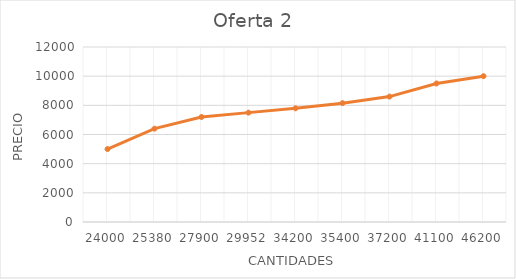
| Category | Precio 1 |
|---|---|
| 24000.0 | 5000 |
| 25380.0 | 6400 |
| 27900.0 | 7200 |
| 29952.0 | 7500 |
| 34200.0 | 7795 |
| 35400.0 | 8150 |
| 37200.0 | 8600 |
| 41100.0 | 9500 |
| 46200.0 | 10000 |